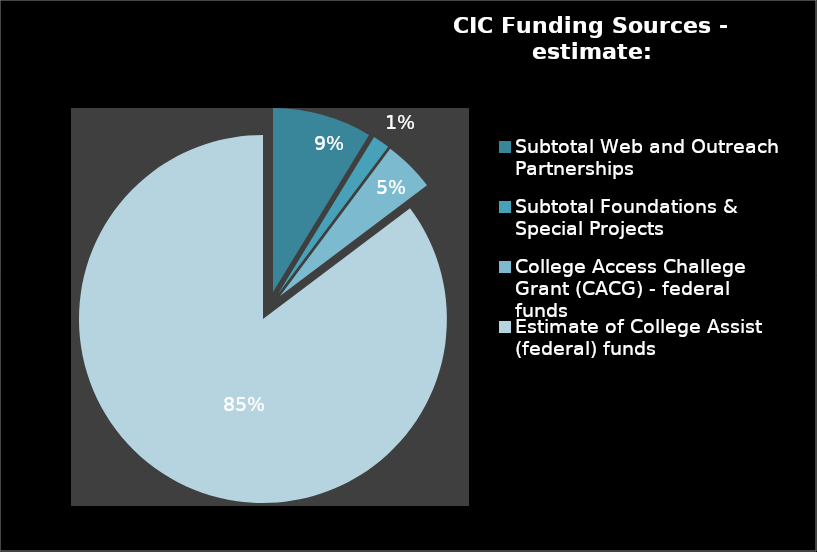
| Category | Series 0 |
|---|---|
| Subtotal Web and Outreach Partnerships | 3403422.29 |
| Subtotal Foundations & Special Projects | 576000 |
| College Access Challege Grant (CACG) - federal funds | 1756666 |
| Estimate of College Assist (federal) funds | 33199095.71 |